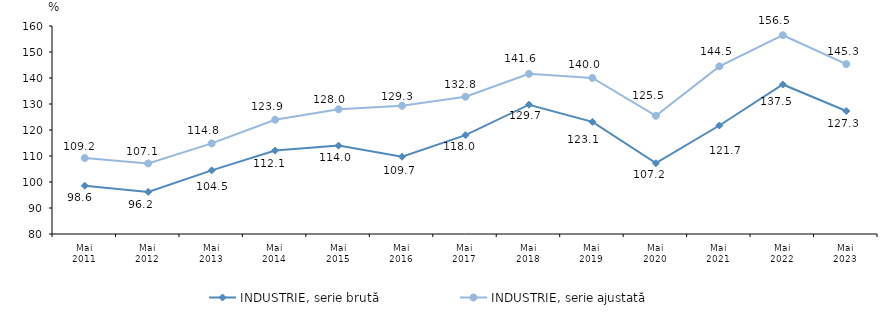
| Category | INDUSTRIE, serie brută | INDUSTRIE, serie ajustată |
|---|---|---|
| Mai
2011 | 98.575 | 109.217 |
| Mai
2012 | 96.182 | 107.131 |
| Mai
2013 | 104.472 | 114.845 |
| Mai
2014 | 112.114 | 123.936 |
| Mai
2015 | 113.992 | 127.962 |
| Mai
2016 | 109.721 | 129.327 |
| Mai
2017 | 118.004 | 132.803 |
| Mai
2018 | 129.735 | 141.611 |
| Mai
2019 | 123.131 | 140.025 |
| Mai
2020 | 107.236 | 125.453 |
| Mai
2021 | 121.721 | 144.469 |
| Mai
2022 | 137.512 | 156.452 |
| Mai
2023 | 127.31 | 145.345 |